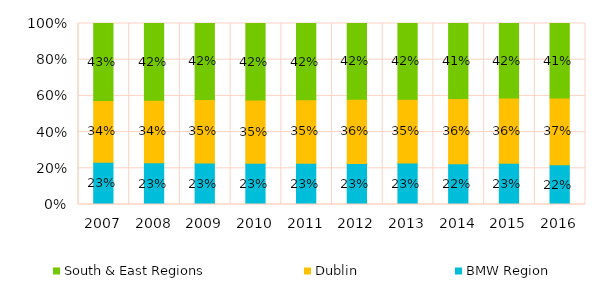
| Category | BMW Region | Dublin | South & East Regions |
|---|---|---|---|
| 2007.0 | 0.233 | 0.341 | 0.426 |
| 2008.0 | 0.231 | 0.345 | 0.424 |
| 2009.0 | 0.229 | 0.35 | 0.419 |
| 2010.0 | 0.228 | 0.349 | 0.423 |
| 2011.0 | 0.228 | 0.351 | 0.421 |
| 2012.0 | 0.226 | 0.355 | 0.419 |
| 2013.0 | 0.227 | 0.35 | 0.415 |
| 2014.0 | 0.225 | 0.361 | 0.414 |
| 2015.0 | 0.23 | 0.364 | 0.416 |
| 2016.0 | 0.22 | 0.369 | 0.412 |